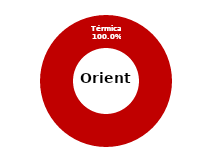
| Category | Oriente |
|---|---|
| Eólica | 0 |
| Hidráulica | 0 |
| Solar | 0 |
| Térmica | 34.553 |